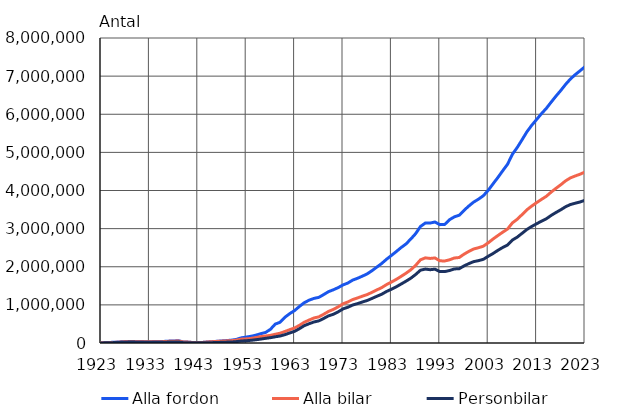
| Category | Alla fordon | Alla bilar | Personbilar |
|---|---|---|---|
| 1923.0 | 5965 | 3576 | 2336 |
| 1924.0 | 10053 | 6678 | 4200 |
| 1925.0 | 15645 | 11921 | 7641 |
| 1926.0 | 21351 | 17230 | 11813 |
| 1927.0 | 28666 | 24376 | 16905 |
| 1928.0 | 37095 | 32190 | 22079 |
| 1929.0 | 40273 | 35030 | 23592 |
| 1930.0 | 40015 | 34781 | 22888 |
| 1931.0 | 38685 | 33959 | 22064 |
| 1932.0 | 35450 | 30843 | 19857 |
| 1933.0 | 34723 | 30167 | 18661 |
| 1934.0 | 36917 | 32101 | 19119 |
| 1935.0 | 38752 | 33811 | 19905 |
| 1936.0 | 41675 | 36558 | 20835 |
| 1937.0 | 48925 | 43299 | 23985 |
| 1938.0 | 53418 | 47226 | 26179 |
| 1939.0 | 59249 | 51771 | 29002 |
| 1940.0 | 28051 | 27161 | 8824 |
| 1941.0 | 23048 | 22808 | 5662 |
| 1942.0 | 12533 | 12438 | 3598 |
| 1943.0 | 14660 | 14560 | 4086 |
| 1944.0 | 15434 | 15363 | 4028 |
| 1945.0 | 26733 | 26310 | 6230 |
| 1946.0 | 35876 | 34489 | 9278 |
| 1947.0 | 44970 | 42270 | 13748 |
| 1948.0 | 54884 | 49135 | 18640 |
| 1949.0 | 64056 | 56193 | 23167 |
| 1950.0 | 75447 | 61256 | 26814 |
| 1951.0 | 94814 | 76206 | 36231 |
| 1952.0 | 136184 | 101252 | 52619 |
| 1953.0 | 155132 | 108270 | 59216 |
| 1954.0 | 176122 | 120687 | 70795 |
| 1955.0 | 205519 | 141576 | 85448 |
| 1956.0 | 244041 | 167078 | 102961 |
| 1957.0 | 276659 | 183813 | 122075 |
| 1958.0 | 357744 | 200088 | 139704 |
| 1959.0 | 495720 | 228918 | 162968 |
| 1960.0 | 543597 | 256892 | 183409 |
| 1961.0 | 675347 | 301586 | 219148 |
| 1962.0 | 771197 | 349888 | 263033 |
| 1963.0 | 851133 | 393920 | 305444 |
| 1964.0 | 958854 | 464255 | 375829 |
| 1965.0 | 1057604 | 544856 | 454854 |
| 1966.0 | 1123515 | 602092 | 505926 |
| 1967.0 | 1169569 | 655757 | 551198 |
| 1968.0 | 1196985 | 685475 | 580747 |
| 1969.0 | 1268791 | 752696 | 643057 |
| 1970.0 | 1346645 | 828010 | 711968 |
| 1971.0 | 1395445 | 880056 | 752915 |
| 1972.0 | 1452715 | 947906 | 818044 |
| 1973.0 | 1522975 | 1028120 | 894104 |
| 1974.0 | 1572635 | 1076208 | 936681 |
| 1975.0 | 1649574 | 1139967 | 996284 |
| 1976.0 | 1697337 | 1181473 | 1032884 |
| 1977.0 | 1753163 | 1227646 | 1075399 |
| 1978.0 | 1813293 | 1270802 | 1115265 |
| 1979.0 | 1897640 | 1329558 | 1169501 |
| 1980.0 | 1991908 | 1392827 | 1225931 |
| 1981.0 | 2086549 | 1452631 | 1279192 |
| 1982.0 | 2197052 | 1532697 | 1352055 |
| 1983.0 | 2296279 | 1597956 | 1410438 |
| 1984.0 | 2397519 | 1667987 | 1473975 |
| 1985.0 | 2502803 | 1746615 | 1546094 |
| 1986.0 | 2596454 | 1828949 | 1619848 |
| 1987.0 | 2725880 | 1919719 | 1698671 |
| 1988.0 | 2866693 | 2034166 | 1795908 |
| 1989.0 | 3055555 | 2180532 | 1908971 |
| 1990.0 | 3146308 | 2233059 | 1938856 |
| 1991.0 | 3146228 | 2218067 | 1922541 |
| 1992.0 | 3173342 | 2230516 | 1936345 |
| 1993.0 | 3104416 | 2156009 | 1872933 |
| 1994.0 | 3108601 | 2150950 | 1872588 |
| 1995.0 | 3233129 | 2181239 | 1900855 |
| 1996.0 | 3308188 | 2229222 | 1942752 |
| 1997.0 | 3351189 | 2242318 | 1948126 |
| 1998.0 | 3478462 | 2328990 | 2021116 |
| 1999.0 | 3593512 | 2403327 | 2082580 |
| 2000.0 | 3697037 | 2465822 | 2134728 |
| 2001.0 | 3773373 | 2499154 | 2160603 |
| 2002.0 | 3863152 | 2539953 | 2194683 |
| 2003.0 | 4004323 | 2626999 | 2274577 |
| 2004.0 | 4174287 | 2727160 | 2346726 |
| 2005.0 | 4341229 | 2818965 | 2430345 |
| 2006.0 | 4517669 | 2906415 | 2505543 |
| 2007.0 | 4689452 | 2989881 | 2570356 |
| 2008.0 | 4950760 | 3150296 | 2700492 |
| 2009.0 | 5128067 | 3246414 | 2776664 |
| 2010.0 | 5331582 | 3368188 | 2877484 |
| 2011.0 | 5539322 | 3494357 | 2978729 |
| 2012.0 | 5711264 | 3592718 | 3057484 |
| 2013.0 | 5862216 | 3681137 | 3127399 |
| 2014.0 | 6014610 | 3766018 | 3194950 |
| 2015.0 | 6152680 | 3847045 | 3257581 |
| 2016.0 | 6316531 | 3957153 | 3346005 |
| 2017.0 | 6474783 | 4056725 | 3422792 |
| 2018.0 | 6623990 | 4151275 | 3494836 |
| 2019.0 | 6785012 | 4253776 | 3574570 |
| 2020.0 | 6926137 | 4331699 | 3632851 |
| 2021.0 | 7040869 | 4382322 | 3667164 |
| 2022.0 | 7142503 | 4428076 | 3699634 |
| 2023.0 | 7247926 | 4485152 | 3744469 |